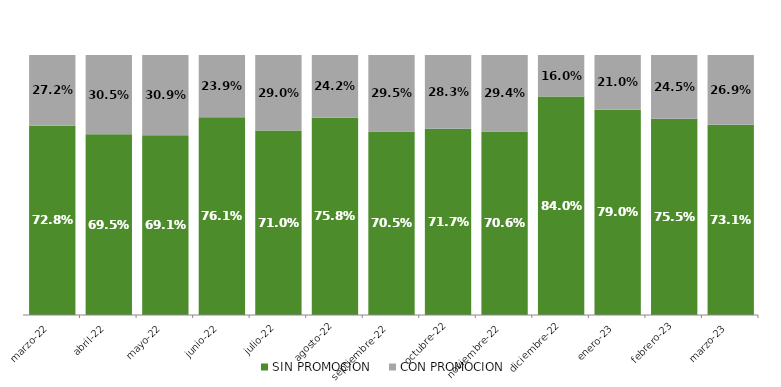
| Category | SIN PROMOCION   | CON PROMOCION   |
|---|---|---|
| 2022-03-01 | 0.728 | 0.272 |
| 2022-04-01 | 0.695 | 0.305 |
| 2022-05-01 | 0.691 | 0.309 |
| 2022-06-01 | 0.761 | 0.239 |
| 2022-07-01 | 0.71 | 0.29 |
| 2022-08-01 | 0.758 | 0.242 |
| 2022-09-01 | 0.705 | 0.295 |
| 2022-10-01 | 0.717 | 0.283 |
| 2022-11-01 | 0.706 | 0.294 |
| 2022-12-01 | 0.84 | 0.16 |
| 2023-01-01 | 0.79 | 0.21 |
| 2023-02-01 | 0.755 | 0.245 |
| 2023-03-01 | 0.731 | 0.269 |